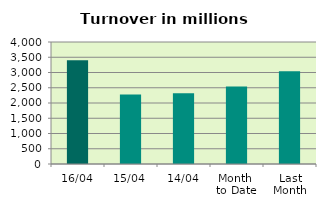
| Category | Series 0 |
|---|---|
| 16/04 | 3400.589 |
| 15/04 | 2280.97 |
| 14/04 | 2319.087 |
| Month 
to Date | 2543.355 |
| Last
Month | 3040.277 |